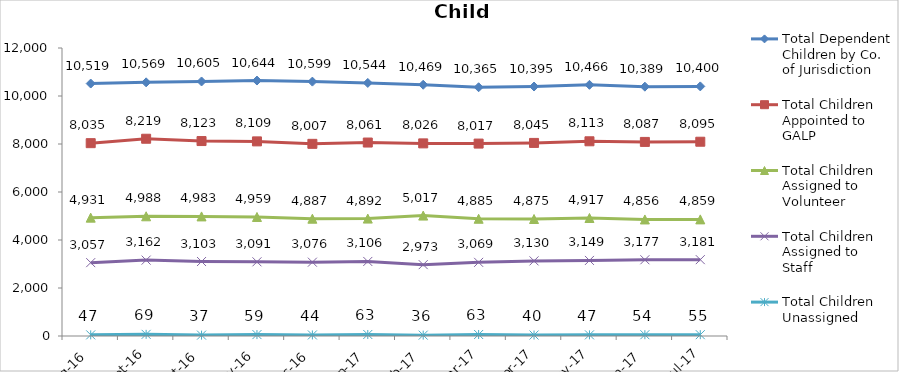
| Category | Total Dependent Children by Co. of Jurisdiction | Total Children Appointed to GALP | Total Children Assigned to Volunteer | Total Children Assigned to Staff | Total Children Unassigned |
|---|---|---|---|---|---|
| Aug-16 | 10519 | 8035 | 4931 | 3057 | 47 |
| Sep-16 | 10569 | 8219 | 4988 | 3162 | 69 |
| Oct-16 | 10605 | 8123 | 4983 | 3103 | 37 |
| Nov-16 | 10644 | 8109 | 4959 | 3091 | 59 |
| Dec-16 | 10599 | 8007 | 4887 | 3076 | 44 |
| Jan-17 | 10544 | 8061 | 4892 | 3106 | 63 |
| Feb-17 | 10469 | 8026 | 5017 | 2973 | 36 |
| Mar-17 | 10365 | 8017 | 4885 | 3069 | 63 |
| Apr-17 | 10395 | 8045 | 4875 | 3130 | 40 |
| May-17 | 10466 | 8113 | 4917 | 3149 | 47 |
| Jun-17 | 10389 | 8087 | 4856 | 3177 | 54 |
| Jul-17 | 10400 | 8095 | 4859 | 3181 | 55 |